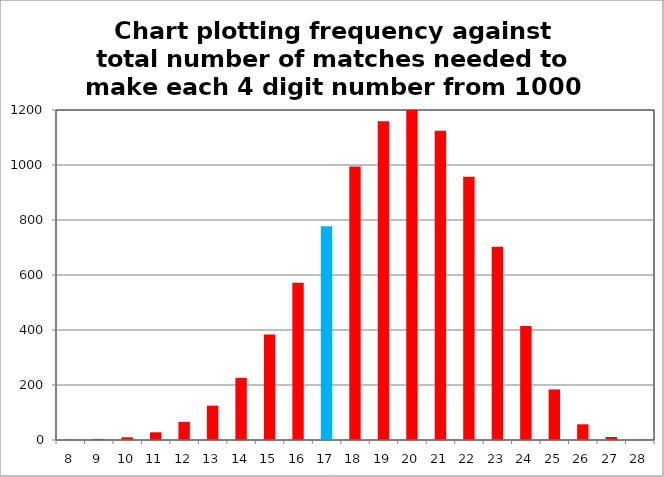
| Category | Frequency |
|---|---|
| 8.0 | 1 |
| 9.0 | 4 |
| 10.0 | 10 |
| 11.0 | 28 |
| 12.0 | 66 |
| 13.0 | 125 |
| 14.0 | 226 |
| 15.0 | 384 |
| 16.0 | 572 |
| 17.0 | 777 |
| 18.0 | 995 |
| 19.0 | 1159 |
| 20.0 | 1200 |
| 21.0 | 1125 |
| 22.0 | 957 |
| 23.0 | 703 |
| 24.0 | 415 |
| 25.0 | 184 |
| 26.0 | 57 |
| 27.0 | 11 |
| 28.0 | 1 |